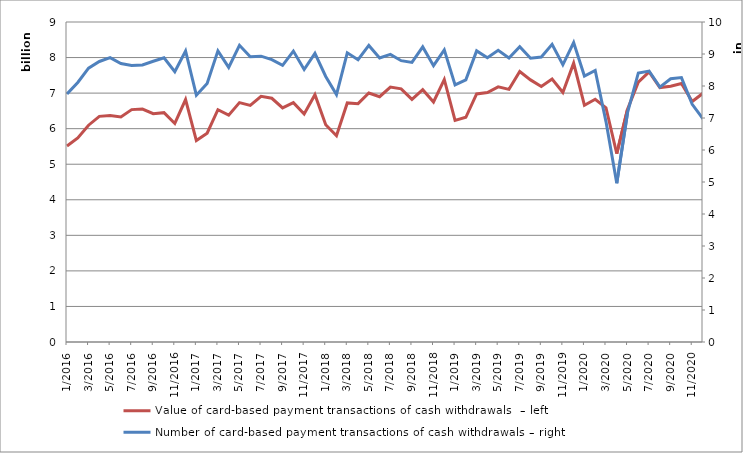
| Category | Value of card-based payment transactions of cash withdrawals  – left |
|---|---|
| 1/2016 | 5514464401 |
| 2/2016 | 5741517621 |
| 3/2016 | 6097170475 |
| 4/2016 | 6346534978 |
| 5/2016 | 6370574517 |
| 6/2016 | 6327736639 |
| 7/2016 | 6535488468 |
| 8/2016 | 6551751429 |
| 9/2016 | 6421891372 |
| 10/2016 | 6450142057 |
| 11/2016 | 6145659859 |
| 12/2016 | 6819331904 |
| 1/2017 | 5666038801 |
| 2/2017 | 5872617770 |
| 3/2017 | 6532401746 |
| 4/2017 | 6381224799 |
| 5/2017 | 6733357752 |
| 6/2017 | 6652542580 |
| 7/2017 | 6911790845 |
| 8/2017 | 6854972720 |
| 9/2017 | 6582349265 |
| 10/2017 | 6730793169 |
| 11/2017 | 6412821254 |
| 12/2017 | 6954726818 |
| 1/2018 | 6109852398 |
| 2/2018 | 5802305920 |
| 3/2018 | 6723678447 |
| 4/2018 | 6703397142 |
| 5/2018 | 7003655927 |
| 6/2018 | 6898560809 |
| 7/2018 | 7170032002 |
| 8/2018 | 7119389645 |
| 9/2018 | 6822560273 |
| 10/2018 | 7094779360 |
| 11/2018 | 6750920337 |
| 12/2018 | 7383228008 |
| 1/2019 | 6233298869 |
| 2/2019 | 6319568186 |
| 3/2019 | 6976532602 |
| 4/2019 | 7016082649 |
| 5/2019 | 7174491760 |
| 6/2019 | 7105294004 |
| 7/2019 | 7605705783 |
| 8/2019 | 7371838879 |
| 9/2019 | 7187827062 |
| 10/2019 | 7393909656 |
| 11/2019 | 7016638376 |
| 12/2019 | 7842206635 |
| 1/2020 | 6659395562 |
| 2/2020 | 6827064486 |
| 3/2020 | 6588633239 |
| 4/2020 | 5296130983 |
| 5/2020 | 6548167544 |
| 6/2020 | 7310296856 |
| 7/2020 | 7597669559 |
| 8/2020 | 7156159858 |
| 9/2020 | 7193976728 |
| 10/2020 | 7270314404 |
| 11/2020 | 6764190056 |
| 12/2020 | 6996163051 |